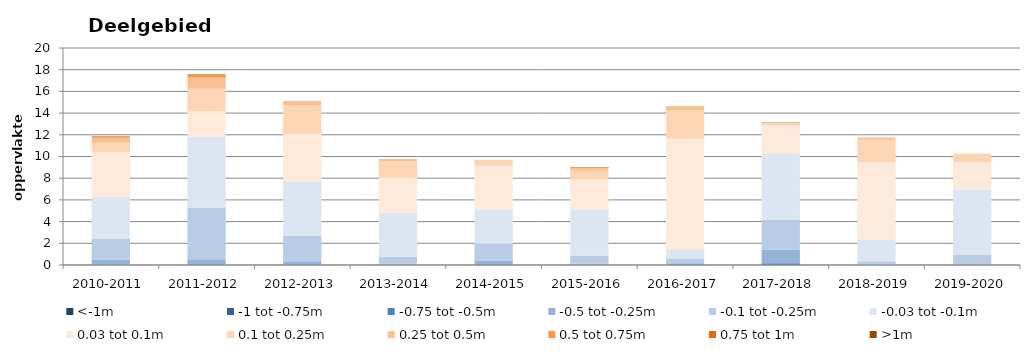
| Category | <-1m | -1 tot -0.75m | -0.75 tot -0.5m | -0.5 tot -0.25m | -0.1 tot -0.25m | -0.03 tot -0.1m | 0.03 tot 0.1m | 0.1 tot 0.25m | 0.25 tot 0.5m | 0.5 tot 0.75m | 0.75 tot 1m | >1m |
|---|---|---|---|---|---|---|---|---|---|---|---|---|
| 2010-2011 | 0 | 0.001 | 0.018 | 0.48 | 1.893 | 3.9 | 4.092 | 0.893 | 0.443 | 0.097 | 0.036 | 0.024 |
| 2011-2012 | 0.004 | 0.009 | 0.041 | 0.465 | 4.755 | 6.578 | 2.319 | 2.084 | 1.022 | 0.195 | 0.034 | 0.06 |
| 2012-2013 | 0 | 0.002 | 0.027 | 0.322 | 2.366 | 4.985 | 4.364 | 2.629 | 0.41 | 0.013 | 0 | 0 |
| 2013-2014 | 0.001 | 0.002 | 0.012 | 0.106 | 0.64 | 4.056 | 3.237 | 1.525 | 0.172 | 0.013 | 0.011 | 0.004 |
| 2014-2015 | 0.009 | 0.015 | 0.047 | 0.298 | 1.582 | 3.136 | 4.047 | 0.502 | 0.044 | 0.004 | 0 | 0 |
| 2015-2016 | 0.001 | 0.002 | 0.019 | 0.093 | 0.728 | 4.268 | 2.761 | 0.879 | 0.216 | 0.043 | 0.011 | 0.004 |
| 2016-2017 | 0.004 | 0.01 | 0.033 | 0.126 | 0.425 | 0.862 | 10.171 | 2.649 | 0.289 | 0.036 | 0.007 | 0.003 |
| 2017-2018 | 0.002 | 0.016 | 0.154 | 1.239 | 2.769 | 6.108 | 2.548 | 0.274 | 0.023 | 0.008 | 0.002 | 0.001 |
| 2018-2019 | 0 | 0 | 0.003 | 0.02 | 0.324 | 2.001 | 7.094 | 2.112 | 0.19 | 0.007 | 0.002 | 0.001 |
| 2019-2020 | 0 | 0 | 0.006 | 0.058 | 0.895 | 6.002 | 2.489 | 0.735 | 0.06 | 0.006 | 0 | 0 |